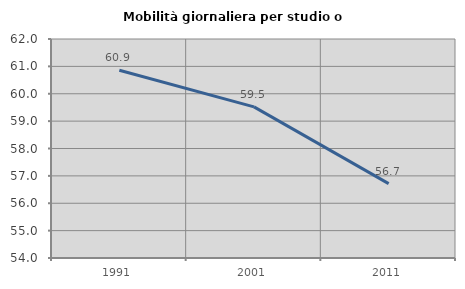
| Category | Mobilità giornaliera per studio o lavoro |
|---|---|
| 1991.0 | 60.861 |
| 2001.0 | 59.519 |
| 2011.0 | 56.716 |